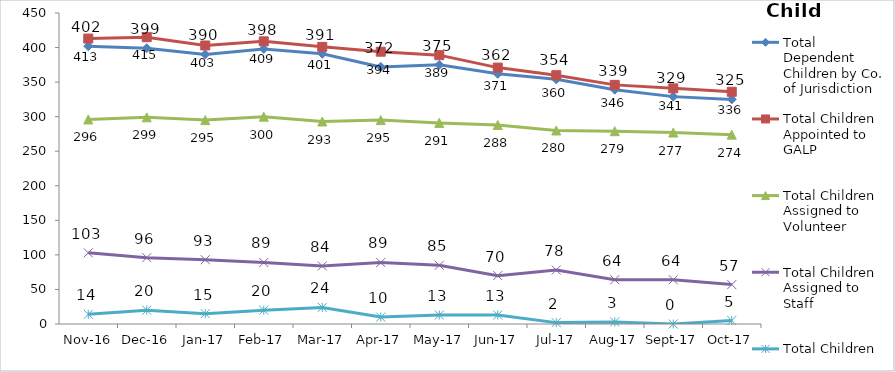
| Category | Total Dependent Children by Co. of Jurisdiction | Total Children Appointed to GALP | Total Children Assigned to Volunteer | Total Children Assigned to Staff | Total Children Unassigned |
|---|---|---|---|---|---|
| 2016-11-01 | 402 | 413 | 296 | 103 | 14 |
| 2016-12-01 | 399 | 415 | 299 | 96 | 20 |
| 2017-01-01 | 390 | 403 | 295 | 93 | 15 |
| 2017-02-01 | 398 | 409 | 300 | 89 | 20 |
| 2017-03-01 | 391 | 401 | 293 | 84 | 24 |
| 2017-04-01 | 372 | 394 | 295 | 89 | 10 |
| 2017-05-01 | 375 | 389 | 291 | 85 | 13 |
| 2017-06-01 | 362 | 371 | 288 | 70 | 13 |
| 2017-07-01 | 354 | 360 | 280 | 78 | 2 |
| 2017-08-01 | 339 | 346 | 279 | 64 | 3 |
| 2017-09-01 | 329 | 341 | 277 | 64 | 0 |
| 2017-10-01 | 325 | 336 | 274 | 57 | 5 |